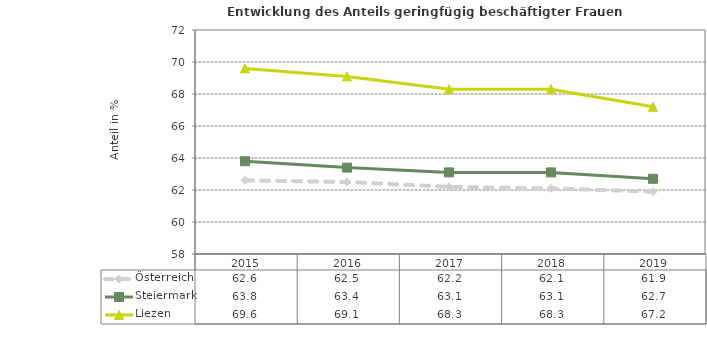
| Category | Österreich | Steiermark | Liezen |
|---|---|---|---|
| 2019.0 | 61.9 | 62.7 | 67.2 |
| 2018.0 | 62.1 | 63.1 | 68.3 |
| 2017.0 | 62.2 | 63.1 | 68.3 |
| 2016.0 | 62.5 | 63.4 | 69.1 |
| 2015.0 | 62.6 | 63.8 | 69.6 |